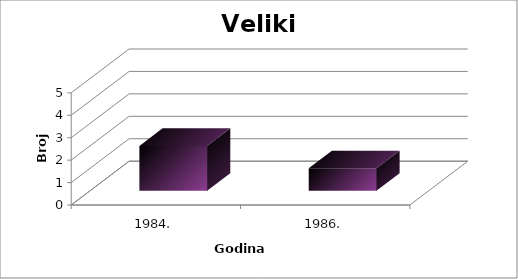
| Category | Broj Primjeraka |
|---|---|
| 1984. | 2 |
| 1986. | 1 |